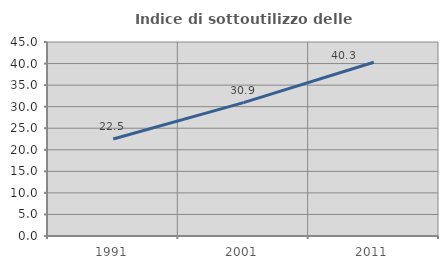
| Category | Indice di sottoutilizzo delle abitazioni  |
|---|---|
| 1991.0 | 22.484 |
| 2001.0 | 30.946 |
| 2011.0 | 40.31 |